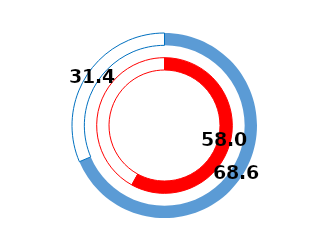
| Category | РС/2021. | Series 1 | ЕУ |
|---|---|---|---|
| Index | 58 |  | 68.6 |
| Rest | 42 |  | 31.4 |